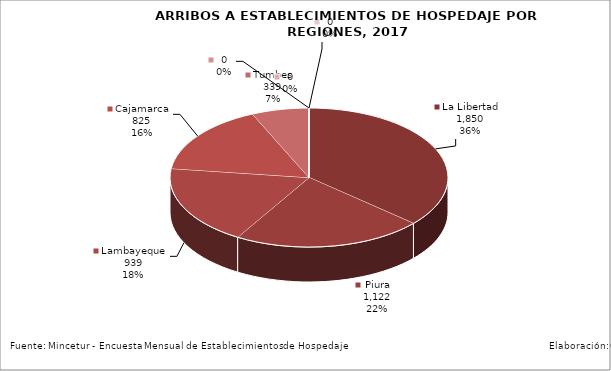
| Category | Series 0 |
|---|---|
| La Libertad | 1850.282 |
| Piura | 1121.565 |
| Lambayeque | 938.572 |
| Cajamarca | 824.506 |
| Tumbes | 338.606 |